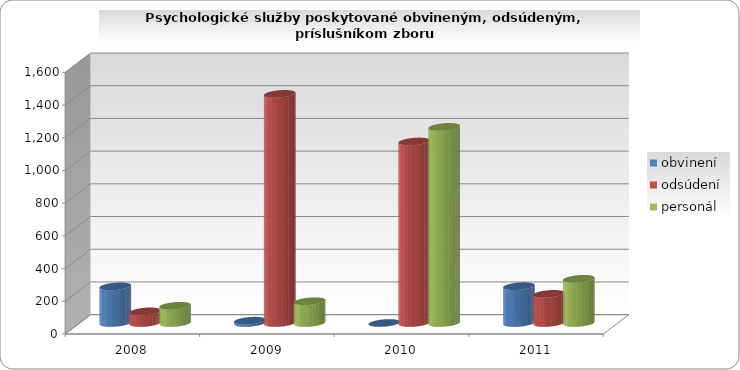
| Category | obvinení | odsúdení | personál |
|---|---|---|---|
| 2008 | 224 | 71 | 105 |
| 2009 | 14 | 1401 | 133 |
| 2010 | 0 | 1110 | 1199 |
| 2011 | 225 | 178 | 270 |